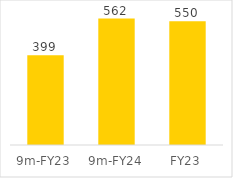
| Category | Series 0 |
|---|---|
| 9m-FY23 | 398.539 |
| 9m-FY24 | 561.886 |
| FY23 | 550.095 |